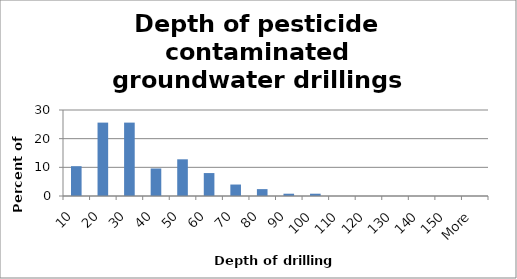
| Category | Series 0 |
|---|---|
| 10 | 10.4 |
| 20 | 25.6 |
| 30 | 25.6 |
| 40 | 9.6 |
| 50 | 12.8 |
| 60 | 8 |
| 70 | 4 |
| 80 | 2.4 |
| 90 | 0.8 |
| 100 | 0.8 |
| 110 | 0 |
| 120 | 0 |
| 130 | 0 |
| 140 | 0 |
| 150 | 0 |
| More | 0 |